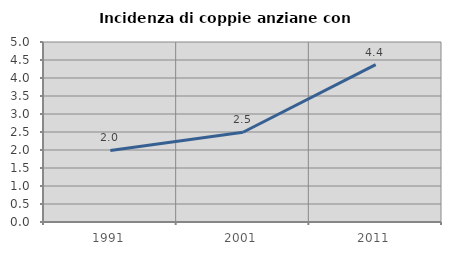
| Category | Incidenza di coppie anziane con figli |
|---|---|
| 1991.0 | 1.989 |
| 2001.0 | 2.493 |
| 2011.0 | 4.373 |